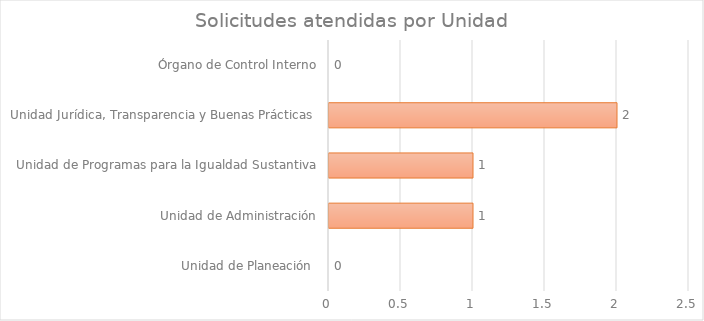
| Category | Series 1 |
|---|---|
| Unidad de Planeación  | 0 |
| Unidad de Administración | 1 |
| Unidad de Programas para la Igualdad Sustantiva | 1 |
| Unidad Jurídica, Transparencia y Buenas Prácticas  | 2 |
| Órgano de Control Interno | 0 |